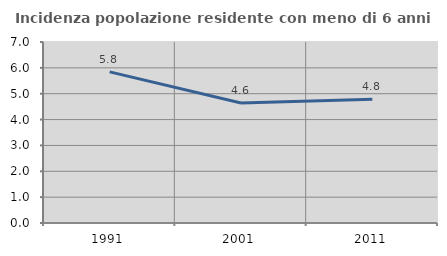
| Category | Incidenza popolazione residente con meno di 6 anni |
|---|---|
| 1991.0 | 5.843 |
| 2001.0 | 4.639 |
| 2011.0 | 4.785 |